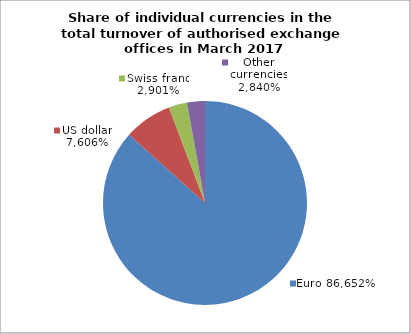
| Category | EUR |
|---|---|
| 0 | 0.867 |
| 1 | 0.076 |
| 2 | 0.029 |
| 3 | 0.028 |